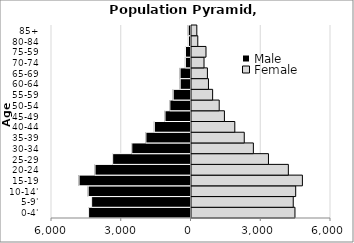
| Category | Male | Female |
|---|---|---|
| 0-4' | -4404.97 | 4450.26 |
| 5-9' | -4274.27 | 4376.14 |
| 10-14' | -4422.05 | 4481.47 |
| 15-19 | -4813.7 | 4769.83 |
| 20-24 | -4128.02 | 4165.45 |
| 25-29 | -3369.66 | 3309.98 |
| 30-34 | -2546.92 | 2660.75 |
| 35-39 | -1940.15 | 2268.86 |
| 40-44 | -1576.9 | 1862.72 |
| 45-49 | -1117.69 | 1415.81 |
| 50-54 | -908.7 | 1191.81 |
| 55-59 | -765.15 | 909.23 |
| 60-64 | -464.57 | 729.63 |
| 65-69 | -469.49 | 684.4 |
| 70-74 | -241.79 | 538.49 |
| 75-59 | -238.1 | 623.56 |
| 80-84 | -110.61 | 270.19 |
| 85+ | -118.66 | 228.88 |